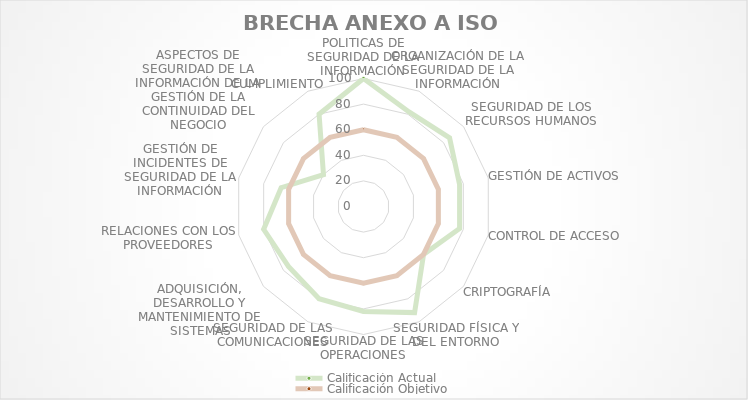
| Category | Calificación Actual | Calificación Objetivo |
|---|---|---|
| POLITICAS DE SEGURIDAD DE LA INFORMACIÓN | 100 | 60 |
| ORGANIZACIÓN DE LA SEGURIDAD DE LA INFORMACIÓN | 82 | 60 |
| SEGURIDAD DE LOS RECURSOS HUMANOS | 86 | 60 |
| GESTIÓN DE ACTIVOS | 77 | 60 |
| CONTROL DE ACCESO | 77 | 60 |
| CRIPTOGRAFÍA | 60 | 60 |
| SEGURIDAD FÍSICA Y DEL ENTORNO | 92 | 60 |
| SEGURIDAD DE LAS OPERACIONES | 82 | 60 |
| SEGURIDAD DE LAS COMUNICACIONES | 80 | 60 |
| ADQUISICIÓN, DESARROLLO Y MANTENIMIENTO DE SISTEMAS | 75 | 60 |
| RELACIONES CON LOS PROVEEDORES | 80 | 60 |
| GESTIÓN DE INCIDENTES DE SEGURIDAD DE LA INFORMACIÓN | 66 | 60 |
| ASPECTOS DE SEGURIDAD DE LA INFORMACIÓN DE LA GESTIÓN DE LA CONTINUIDAD DEL NEGOCIO | 40 | 60 |
| CUMPLIMIENTO | 80 | 60 |